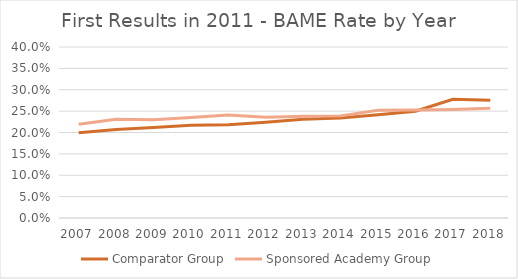
| Category | Comparator Group | Sponsored Academy Group |
|---|---|---|
| 2007.0 | 0.199 | 0.219 |
| 2008.0 | 0.207 | 0.231 |
| 2009.0 | 0.211 | 0.23 |
| 2010.0 | 0.217 | 0.235 |
| 2011.0 | 0.218 | 0.241 |
| 2012.0 | 0.224 | 0.235 |
| 2013.0 | 0.231 | 0.238 |
| 2014.0 | 0.234 | 0.239 |
| 2015.0 | 0.241 | 0.252 |
| 2016.0 | 0.25 | 0.252 |
| 2017.0 | 0.278 | 0.254 |
| 2018.0 | 0.275 | 0.257 |